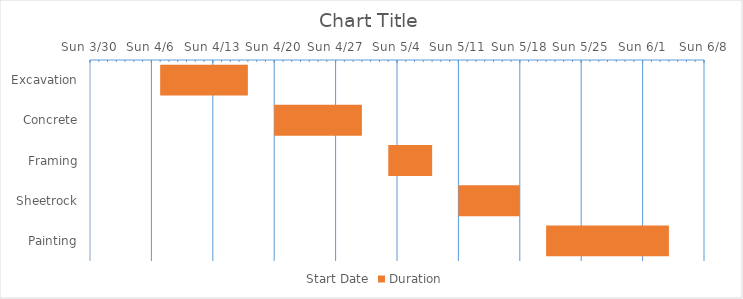
| Category | Start Date | Duration |
|---|---|---|
| Excavation | 2014-04-07 | 10 |
| Concrete | 2014-04-20 | 10 |
| Framing | 2014-05-03 | 5 |
| Sheetrock | 2014-05-11 | 7 |
| Painting | 2014-05-21 | 14 |